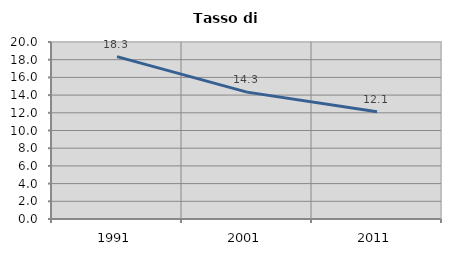
| Category | Tasso di disoccupazione   |
|---|---|
| 1991.0 | 18.348 |
| 2001.0 | 14.337 |
| 2011.0 | 12.122 |